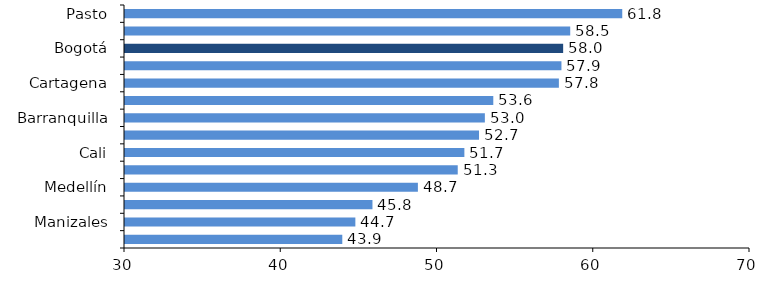
| Category | Series 0 |
|---|---|
| Pasto | 61.824 |
| Montería | 58.494 |
| Bogotá | 58.042 |
| Villavicencio | 57.932 |
| Cartagena | 57.768 |
| Total 13 áreas | 53.571 |
| Barranquilla | 53.031 |
| Bucaramanga | 52.657 |
| Cali | 51.72 |
| Cúcuta | 51.295 |
| Medellín | 48.745 |
| Ibagué | 45.838 |
| Manizales | 44.744 |
| Pereira | 43.907 |